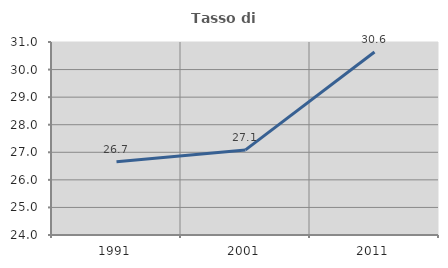
| Category | Tasso di occupazione   |
|---|---|
| 1991.0 | 26.656 |
| 2001.0 | 27.087 |
| 2011.0 | 30.639 |